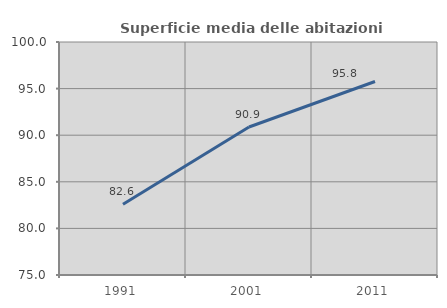
| Category | Superficie media delle abitazioni occupate |
|---|---|
| 1991.0 | 82.592 |
| 2001.0 | 90.884 |
| 2011.0 | 95.764 |